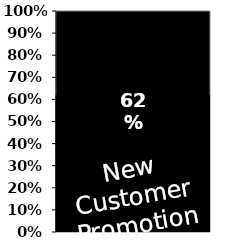
| Category | Series 1 | Series 0 |
|---|---|---|
| 0 |  | 0.619 |